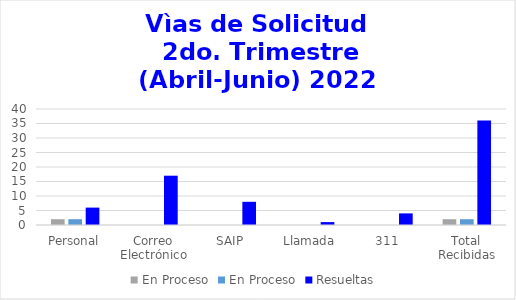
| Category | En Proceso | Resueltas  |
|---|---|---|
| Personal | 2 | 6 |
| Correo Electrónico | 0 | 17 |
| SAIP | 0 | 8 |
| Llamada | 0 | 1 |
| 311 | 0 | 4 |
| Total Recibidas | 2 | 36 |